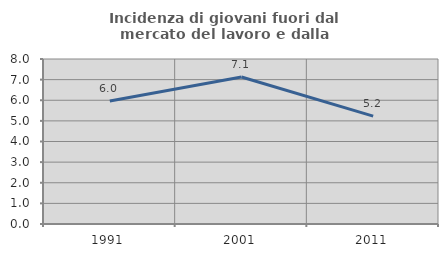
| Category | Incidenza di giovani fuori dal mercato del lavoro e dalla formazione  |
|---|---|
| 1991.0 | 5.961 |
| 2001.0 | 7.13 |
| 2011.0 | 5.233 |